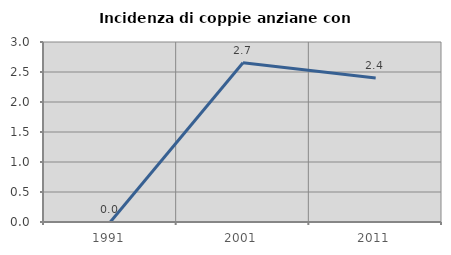
| Category | Incidenza di coppie anziane con figli |
|---|---|
| 1991.0 | 0 |
| 2001.0 | 2.655 |
| 2011.0 | 2.4 |